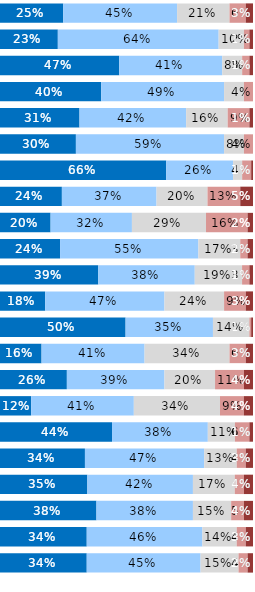
| Category | Almost Always or Always | Usually | Occasionally | Seldom | Never or Almost Never |
|---|---|---|---|---|---|
| Q1 | 0.25 | 0.45 | 0.207 | 0.064 | 0.029 |
| Q2 | 0.229 | 0.636 | 0.1 | 0.021 | 0.014 |
| Q3 | 0.471 | 0.407 | 0.079 | 0.029 | 0.014 |
| Q4 | 0.4 | 0.486 | 0.079 | 0.036 | 0 |
| Q5 | 0.314 | 0.421 | 0.164 | 0.086 | 0.014 |
| Q6 | 0.3 | 0.586 | 0.079 | 0.036 | 0 |
| Q7 | 0.657 | 0.264 | 0.036 | 0.036 | 0.007 |
| Q8 | 0.245 | 0.374 | 0.201 | 0.129 | 0.05 |
| Q9 | 0.2 | 0.321 | 0.293 | 0.164 | 0.021 |
| Q10 | 0.237 | 0.547 | 0.165 | 0.029 | 0.022 |
| Q11 | 0.388 | 0.381 | 0.187 | 0.029 | 0.014 |
| Q12 | 0.179 | 0.471 | 0.236 | 0.086 | 0.029 |
| Q13 | 0.496 | 0.345 | 0.144 | 0.007 | 0.007 |
| Q14 | 0.164 | 0.407 | 0.336 | 0.064 | 0.029 |
| Q15 | 0.264 | 0.386 | 0.2 | 0.114 | 0.036 |
| Q16 | 0.123 | 0.406 | 0.341 | 0.094 | 0.036 |
| Q17 | 0.443 | 0.379 | 0.107 | 0.057 | 0.014 |
| Q18 | 0.336 | 0.471 | 0.129 | 0.036 | 0.029 |
| Q19 | 0.345 | 0.417 | 0.165 | 0.036 | 0.036 |
| Q20 | 0.381 | 0.381 | 0.151 | 0.05 | 0.036 |
| Q21 | 0.343 | 0.457 | 0.136 | 0.036 | 0.029 |
| Q22 | 0.343 | 0.45 | 0.15 | 0.036 | 0.021 |